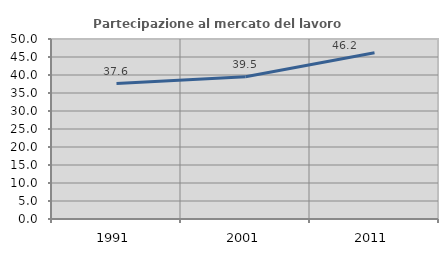
| Category | Partecipazione al mercato del lavoro  femminile |
|---|---|
| 1991.0 | 37.616 |
| 2001.0 | 39.535 |
| 2011.0 | 46.165 |